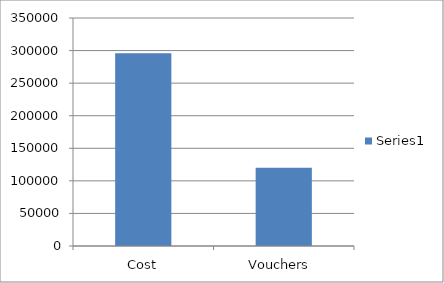
| Category | Series 0 |
|---|---|
| Cost | 295751 |
| Vouchers  | 120000 |